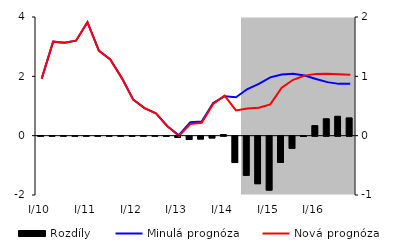
| Category | Rozdíly |
|---|---|
| I/10 | 0 |
| II | 0 |
| III | 0.001 |
| IV | 0 |
| I/11 | 0 |
| II | 0.002 |
| III | 0.001 |
| IV | 0.001 |
| I/12 | -0.001 |
| II | 0.003 |
| III | 0.002 |
| IV | -0.001 |
| I/13 | -0.022 |
| II | -0.056 |
| III | -0.048 |
| IV | -0.03 |
| I/14 | 0.018 |
| II | -0.444 |
| III | -0.66 |
| IV | -0.801 |
| I/15 | -0.909 |
| II | -0.442 |
| III | -0.204 |
| IV | -0.005 |
| I/16 | 0.17 |
| II | 0.285 |
| III | 0.327 |
| IV | 0.3 |